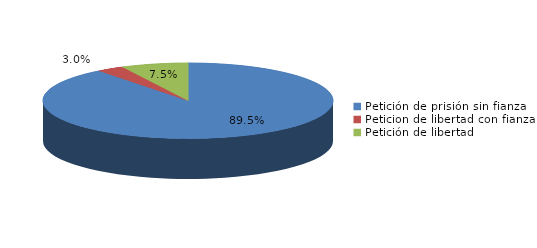
| Category | Series 0 |
|---|---|
| Petición de prisión sin fianza | 179 |
| Peticion de libertad con fianza | 6 |
| Petición de libertad | 15 |